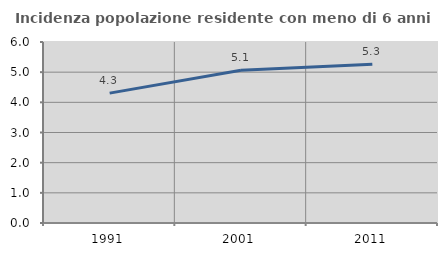
| Category | Incidenza popolazione residente con meno di 6 anni |
|---|---|
| 1991.0 | 4.305 |
| 2001.0 | 5.066 |
| 2011.0 | 5.263 |